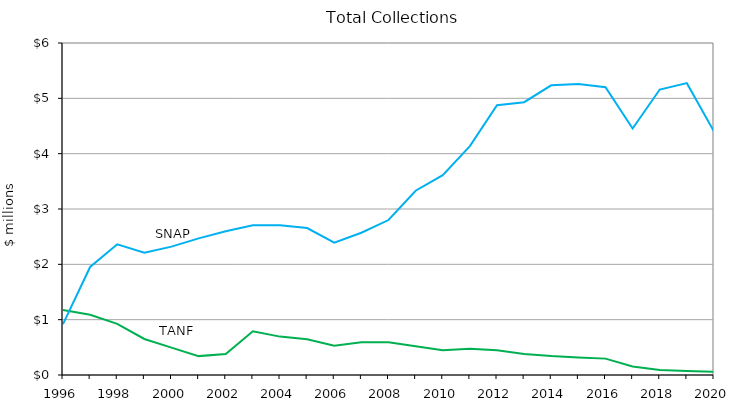
| Category | TANF | SNAP |
|---|---|---|
| 1996 | 1.173 | 0.919 |
| 1997 | 1.09 | 1.953 |
| 1998 | 0.924 | 2.361 |
| 1999 | 0.651 | 2.212 |
| 2000 | 0.495 | 2.32 |
| 2001 | 0.341 | 2.469 |
| 2002 | 0.379 | 2.597 |
| 2003 | 0.79 | 2.704 |
| 2004 | 0.694 | 2.706 |
| 2005 | 0.648 | 2.656 |
| 2006 | 0.53 | 2.391 |
| 2007 | 0.59 | 2.571 |
| 2008 | 0.592 | 2.801 |
| 2009 | 0.52 | 3.33 |
| 2010 | 0.445 | 3.611 |
| 2011 | 0.474 | 4.136 |
| 2012 | 0.447 | 4.876 |
| 2013 | 0.381 | 4.93 |
| 2014 | 0.344 | 5.235 |
| 2015 | 0.318 | 5.258 |
| 2016 | 0.296 | 5.202 |
| 2017 | 0.153 | 4.455 |
| 2018 | 0.092 | 5.159 |
| 2019 | 0.072 | 5.274 |
| 2020 | 0.06 | 4.401 |